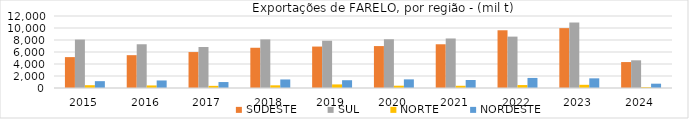
| Category | SUDESTE | SUL | NORTE | NORDESTE |
|---|---|---|---|---|
| 2015.0 | 5148.258 | 8072.194 | 466.34 | 1139.803 |
| 2016.0 | 5471.278 | 7289.822 | 425.856 | 1256.835 |
| 2017.0 | 5991.424 | 6834.373 | 358.473 | 992.787 |
| 2018.0 | 6707.172 | 8095.499 | 446.221 | 1423.146 |
| 2019.0 | 6907.054 | 7876.455 | 597.366 | 1296.21 |
| 2020.0 | 6987.633 | 8122.291 | 383.992 | 1438.456 |
| 2021.0 | 7288.539 | 8253.685 | 371.504 | 1338.07 |
| 2022.0 | 9620.489 | 8564.324 | 491.479 | 1676.588 |
| 2023.0 | 9977.126 | 10914.575 | 531.422 | 1610.493 |
| 2024.0 | 4322.323 | 4614.825 | 142.158 | 719.863 |